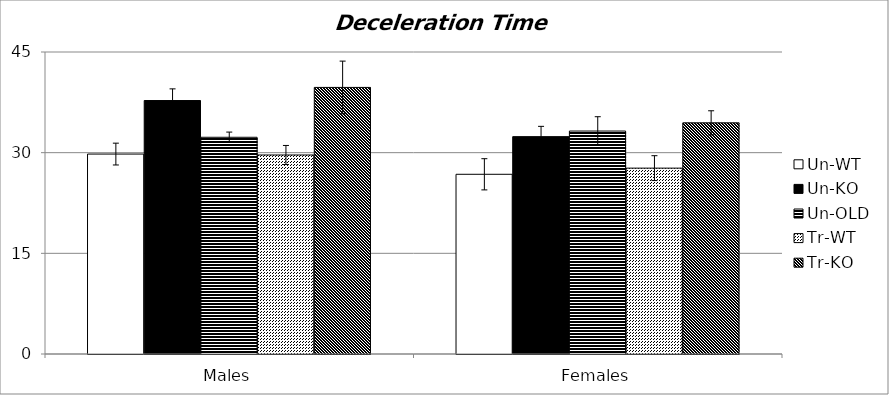
| Category | Un-WT | Un-KO | Un-OLD | Tr-WT | Tr-KO |
|---|---|---|---|---|---|
| 0 | 29.792 | 37.767 | 32.293 | 29.653 | 39.722 |
| 1 | 26.778 | 32.389 | 33.222 | 27.694 | 34.444 |